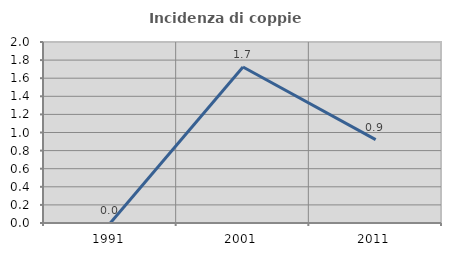
| Category | Incidenza di coppie miste |
|---|---|
| 1991.0 | 0 |
| 2001.0 | 1.724 |
| 2011.0 | 0.922 |